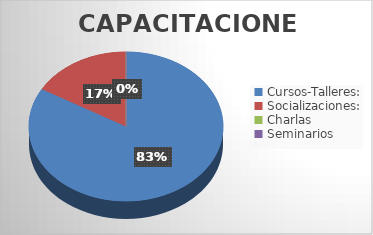
| Category | Series 0 |
|---|---|
| Cursos-Talleres: | 5 |
| Socializaciones: | 1 |
| Charlas | 0 |
| Seminarios | 0 |